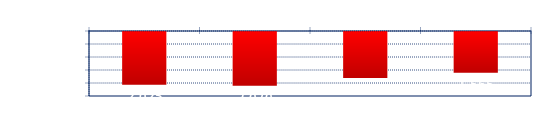
| Category | Series 0 |
|---|---|
| 0 | -2.025 |
| 1 | -2.07 |
| 2 | -1.77 |
| 3 | -1.565 |